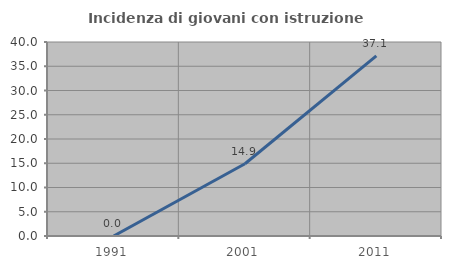
| Category | Incidenza di giovani con istruzione universitaria |
|---|---|
| 1991.0 | 0 |
| 2001.0 | 14.894 |
| 2011.0 | 37.143 |